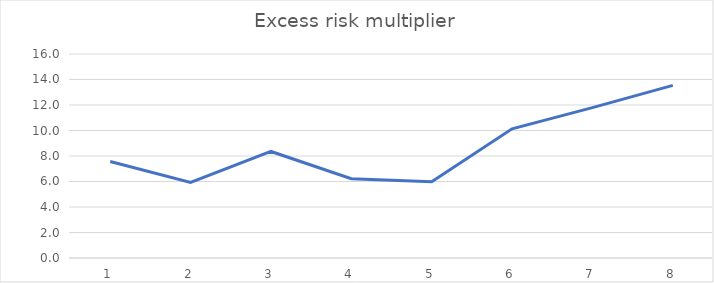
| Category | Excess risk multiplier |
|---|---|
| 0 | 7.567 |
| 1 | 5.932 |
| 2 | 8.356 |
| 3 | 6.218 |
| 4 | 5.979 |
| 5 | 10.136 |
| 6 | 11.791 |
| 7 | 13.537 |